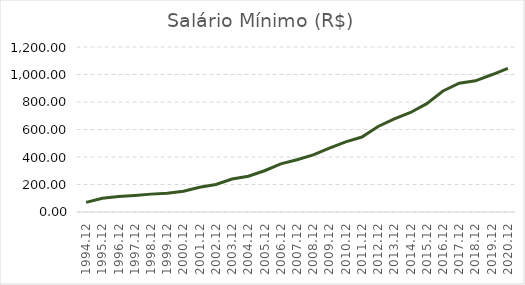
| Category | Salário Mínimo (R$) |
|---|---|
| 1994.12 | 70 |
| 1995.12 | 100 |
| 1996.12 | 112 |
| 1997.12 | 120 |
| 1998.12 | 130 |
| 1999.12 | 136 |
| 2000.12 | 151 |
| 2001.12 | 180 |
| 2002.12 | 200 |
| 2003.12 | 240 |
| 2004.12 | 260 |
| 2005.12 | 300 |
| 2006.12 | 350 |
| 2007.12 | 380 |
| 2008.12 | 415 |
| 2009.12 | 465 |
| 2010.12 | 510 |
| 2011.12 | 545 |
| 2012.12 | 622 |
| 2013.12 | 678 |
| 2014.12 | 724 |
| 2015.12 | 788 |
| 2016.12 | 880 |
| 2017.12 | 937 |
| 2018.12 | 954 |
| 2019.12 | 998 |
| 2020.12 | 1045 |